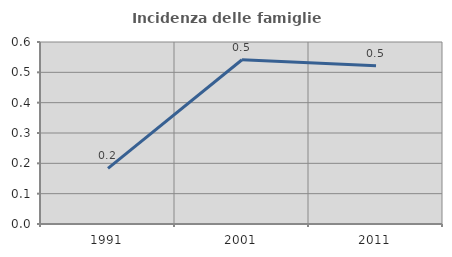
| Category | Incidenza delle famiglie numerose |
|---|---|
| 1991.0 | 0.183 |
| 2001.0 | 0.542 |
| 2011.0 | 0.522 |